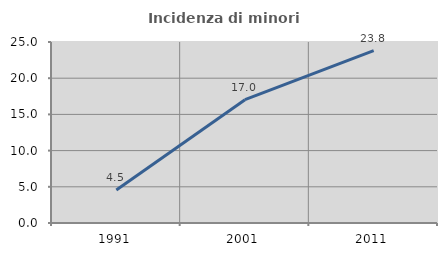
| Category | Incidenza di minori stranieri |
|---|---|
| 1991.0 | 4.545 |
| 2001.0 | 17.033 |
| 2011.0 | 23.81 |